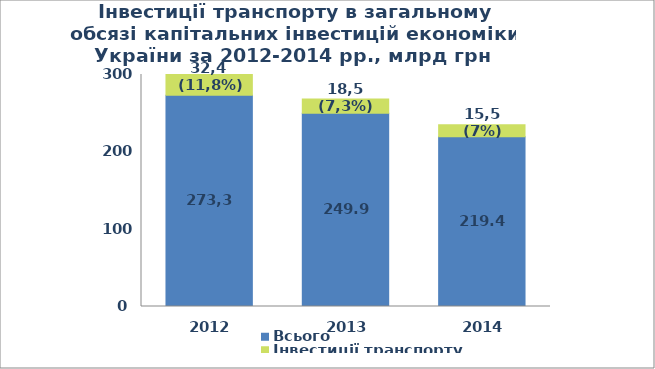
| Category | Всього | Інвестиції транспорту |
|---|---|---|
| 2012.0 | 273.3 | 32.4 |
| 2013.0 | 249.9 | 18.5 |
| 2014.0 | 219.4 | 15.5 |